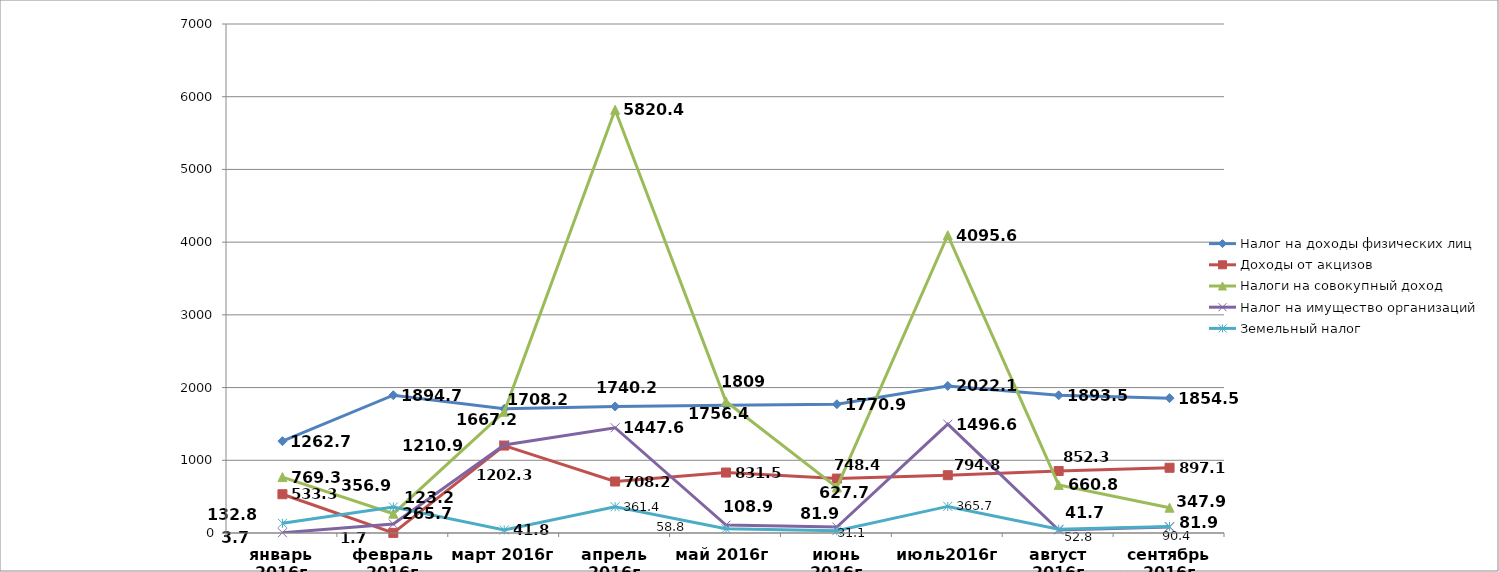
| Category | Налог на доходы физических лиц | Доходы от акцизов | Налоги на совокупный доход | Налог на имущество организаций | Земельный налог |
|---|---|---|---|---|---|
| январь 2016г | 1262.7 | 533.3 | 769.3 | 3.7 | 132.8 |
| февраль 2016г | 1894.7 | 1.7 | 265.7 | 123.2 | 356.9 |
| март 2016г | 1708.2 | 1202.3 | 1667.2 | 1210.9 | 41.8 |
| апрель 2016г | 1740.2 | 708.2 | 5820.4 | 1447.6 | 361.4 |
| май 2016г | 1756.4 | 831.5 | 1809 | 108.9 | 58.8 |
| июнь 2016г | 1770.9 | 748.4 | 627.7 | 81.9 | 31.1 |
| июль2016г | 2022.1 | 794.8 | 4095.6 | 1496.6 | 365.7 |
| август 2016г | 1893.5 | 852.3 | 660.8 | 41.7 | 52.8 |
| сентябрь 2016г | 1854.5 | 897.1 | 347.9 | 81.9 | 90.4 |